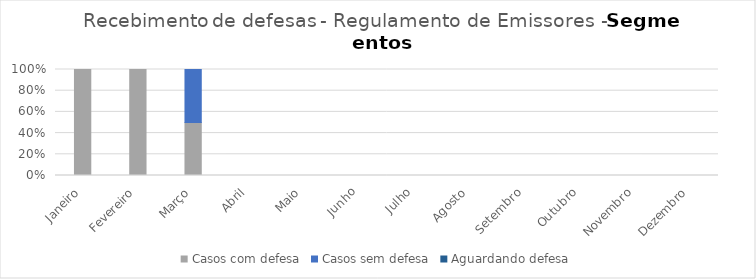
| Category | Casos com defesa | Casos sem defesa | Aguardando defesa |
|---|---|---|---|
| Janeiro | 2 | 0 | 0 |
| Fevereiro | 1 | 0 | 0 |
| Março | 1 | 1 | 0 |
| Abril | 0 | 0 | 0 |
| Maio | 0 | 0 | 0 |
| Junho | 0 | 0 | 0 |
| Julho | 0 | 0 | 0 |
| Agosto | 0 | 0 | 0 |
| Setembro | 0 | 0 | 0 |
| Outubro | 0 | 0 | 0 |
| Novembro | 0 | 0 | 0 |
| Dezembro | 0 | 0 | 0 |